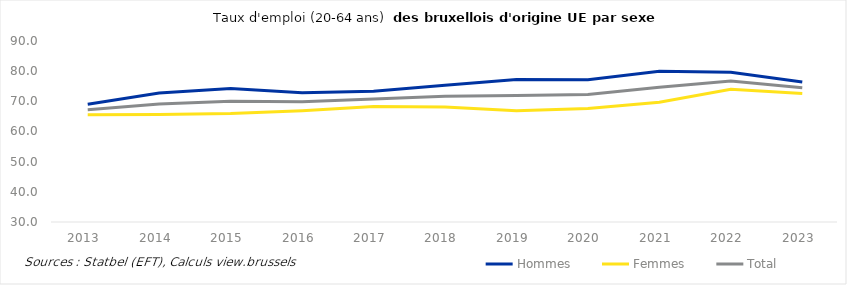
| Category | Hommes | Femmes | Total |
|---|---|---|---|
| 2013.0 | 69.064 | 65.58 | 67.227 |
| 2014.0 | 72.782 | 65.596 | 69.12 |
| 2015.0 | 74.233 | 65.967 | 70.011 |
| 2016.0 | 72.868 | 66.875 | 69.838 |
| 2017.0 | 73.365 | 68.252 | 70.776 |
| 2018.0 | 75.343 | 68.133 | 71.687 |
| 2019.0 | 77.273 | 66.854 | 71.927 |
| 2020.0 | 77.178 | 67.637 | 72.25 |
| 2021.0 | 79.955 | 69.665 | 74.693 |
| 2022.0 | 79.657 | 74.035 | 76.753 |
| 2023.0 | 76.386 | 72.595 | 74.489 |